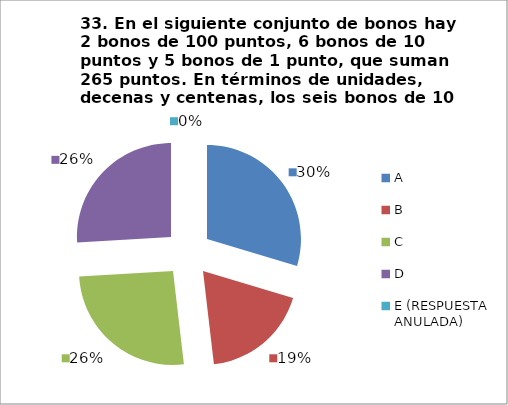
| Category | CANTIDAD DE RESPUESTAS PREGUNTA (33) | PORCENTAJE |
|---|---|---|
| A | 8 | 0.296 |
| B | 5 | 0.185 |
| C | 7 | 0.259 |
| D | 7 | 0.259 |
| E (RESPUESTA ANULADA) | 0 | 0 |